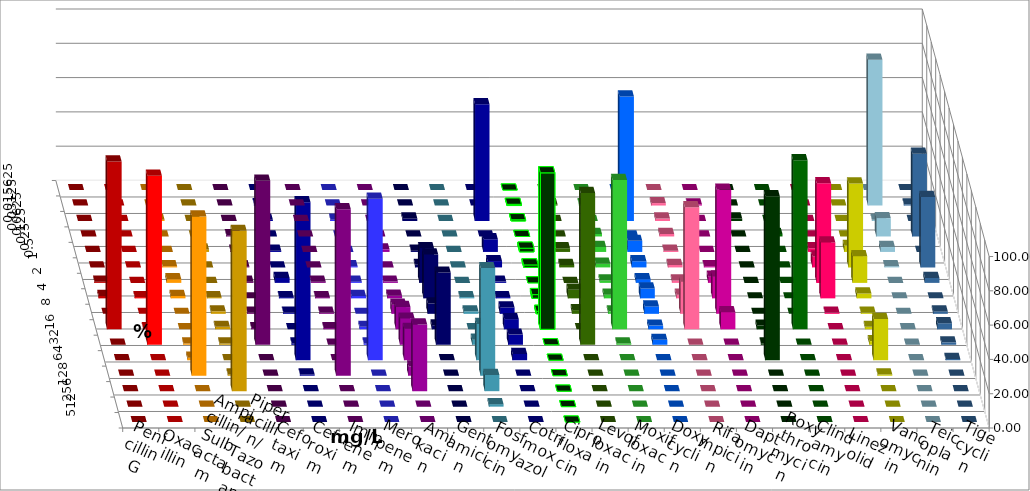
| Category | Penicillin G | Oxacillin | Ampicillin/ Sulbactam | Piperacillin/ Tazobactam | Cefotaxim | Cefuroxim | Imipenem | Meropenem | Amikacin | Gentamicin | Fosfomycin | Cotrimoxazol | Ciprofloxacin | Levofloxacin | Moxifloxacin | Doxycyclin | Rifampicin | Daptomycin | Roxythromycin | Clindamycin | Linezolid | Vancomycin | Teicoplanin | Tigecyclin |
|---|---|---|---|---|---|---|---|---|---|---|---|---|---|---|---|---|---|---|---|---|---|---|---|---|
| 0.015625 | 0 | 0 | 0 | 0 | 0 | 0 | 0 | 0 | 0 | 0 | 0 | 0 | 0 | 0 | 0 | 0 | 0 | 0 | 0 | 0 | 0 | 0 | 0 | 0 |
| 0.03125 | 0 | 0 | 0 | 0 | 0 | 0 | 0.714 | 0 | 0 | 0 | 0 | 0 | 0.73 | 0.719 | 0.719 | 0 | 1.439 | 0.709 | 0 | 0 | 0 | 0 | 0.709 | 85 |
| 0.0625 | 0 | 0 | 0.714 | 0 | 0 | 0 | 0.714 | 0.719 | 0 | 1.504 | 0 | 68.148 | 0.73 | 0 | 0 | 72.662 | 1.439 | 0 | 1.449 | 0 | 0 | 0 | 0 | 0.714 |
| 0.125 | 0 | 0 | 0 | 0 | 0.719 | 0 | 0 | 0 | 0 | 0 | 0 | 0 | 0 | 0 | 1.439 | 0 | 1.439 | 0 | 0 | 1.439 | 0 | 0 | 48.227 | 10.714 |
| 0.25 | 0 | 0 | 0 | 1.439 | 0.719 | 0 | 0.714 | 0 | 1.527 | 0.752 | 0 | 7.407 | 2.19 | 2.158 | 2.878 | 6.475 | 0.719 | 0 | 0 | 0 | 2.128 | 3.546 | 0 | 2.857 |
| 0.5 | 0 | 0 | 0.714 | 0 | 0.719 | 0 | 0 | 0.719 | 0 | 1.504 | 0 | 3.704 | 1.46 | 1.439 | 2.158 | 3.597 | 1.439 | 0.709 | 0 | 0 | 6.383 | 48.936 | 41.135 | 0.714 |
| 1.0 | 0.719 | 0 | 2.143 | 0 | 0.719 | 0.719 | 2.857 | 0.719 | 0.763 | 20.301 | 0 | 0.741 | 0 | 0 | 1.439 | 2.158 | 1.439 | 3.546 | 0 | 0 | 58.156 | 15.603 | 2.837 | 0 |
| 2.0 | 1.439 | 0.719 | 1.429 | 0.719 | 0 | 0.719 | 0.714 | 1.439 | 1.527 | 25.564 | 0.73 | 0.741 | 2.19 | 5.036 | 2.158 | 5.755 | 2.158 | 12.766 | 0 | 0 | 32.624 | 2.837 | 0 | 0 |
| 4.0 | 0 | 0 | 0 | 1.439 | 0.719 | 0.719 | 0.714 | 0 | 5.344 | 6.015 | 1.46 | 3.704 | 1.46 | 2.158 | 1.439 | 4.317 | 18.705 | 72.34 | 0 | 0 | 0.709 | 0.709 | 1.418 | 0 |
| 8.0 | 97.842 | 0.719 | 0 | 1.439 | 0.719 | 0.719 | 0 | 1.439 | 12.977 | 2.256 | 0 | 5.926 | 91.241 | 0 | 87.05 | 2.158 | 71.223 | 9.929 | 2.174 | 98.561 | 0 | 1.418 | 3.546 | 0 |
| 16.0 | 0 | 98.561 | 0.714 | 0.719 | 95.683 | 0 | 0.714 | 0.719 | 15.267 | 42.105 | 2.92 | 5.926 | 0 | 88.489 | 0.719 | 2.878 | 0 | 0 | 0.725 | 0 | 0 | 2.128 | 1.418 | 0 |
| 32.0 | 0 | 0 | 1.429 | 0 | 0 | 0 | 92.143 | 94.245 | 18.321 | 0 | 21.168 | 3.704 | 0 | 0 | 0 | 0 | 0 | 0 | 95.652 | 0 | 0 | 24.113 | 0.709 | 0 |
| 64.0 | 0 | 0 | 92.857 | 0.719 | 0 | 97.122 | 0.714 | 0 | 5.344 | 0 | 62.774 | 0 | 0 | 0 | 0 | 0 | 0 | 0 | 0 | 0 | 0 | 0.709 | 0 | 0 |
| 128.0 | 0 | 0 | 0 | 93.525 | 0 | 0 | 0 | 0 | 38.931 | 0 | 9.489 | 0 | 0 | 0 | 0 | 0 | 0 | 0 | 0 | 0 | 0 | 0 | 0 | 0 |
| 256.0 | 0 | 0 | 0 | 0 | 0 | 0 | 0 | 0 | 0 | 0 | 1.46 | 0 | 0 | 0 | 0 | 0 | 0 | 0 | 0 | 0 | 0 | 0 | 0 | 0 |
| 512.0 | 0 | 0 | 0 | 0 | 0 | 0 | 0 | 0 | 0 | 0 | 0 | 0 | 0 | 0 | 0 | 0 | 0 | 0 | 0 | 0 | 0 | 0 | 0 | 0 |